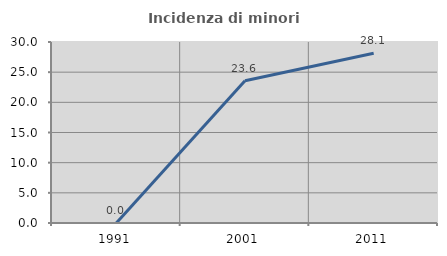
| Category | Incidenza di minori stranieri |
|---|---|
| 1991.0 | 0 |
| 2001.0 | 23.585 |
| 2011.0 | 28.125 |